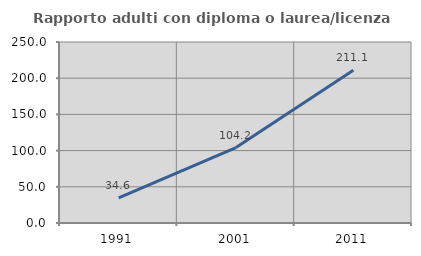
| Category | Rapporto adulti con diploma o laurea/licenza media  |
|---|---|
| 1991.0 | 34.615 |
| 2001.0 | 104.167 |
| 2011.0 | 211.111 |